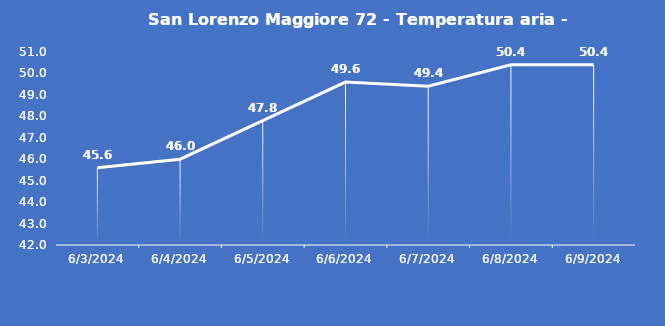
| Category | San Lorenzo Maggiore 72 - Temperatura aria - Grezzo (°C) |
|---|---|
| 6/3/24 | 45.6 |
| 6/4/24 | 46 |
| 6/5/24 | 47.8 |
| 6/6/24 | 49.6 |
| 6/7/24 | 49.4 |
| 6/8/24 | 50.4 |
| 6/9/24 | 50.4 |